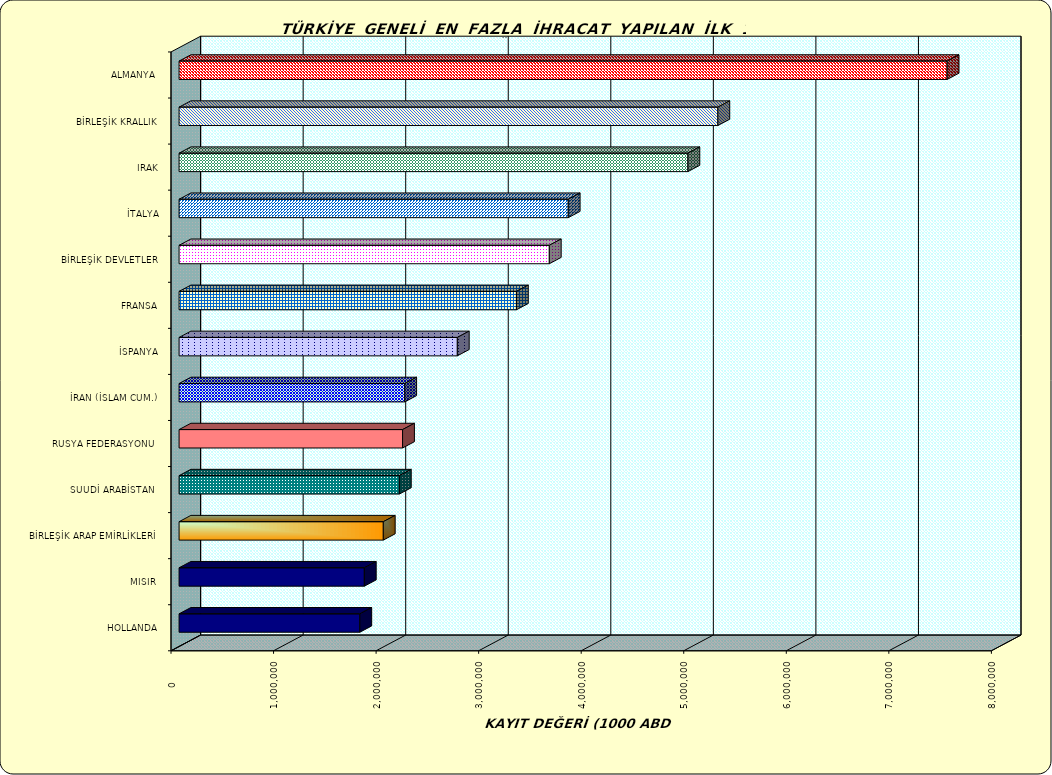
| Category | Series 0 |
|---|---|
| ALMANYA  | 7489705.227 |
| BİRLEŞİK KRALLIK | 5254062.433 |
| IRAK | 4962097.796 |
| İTALYA | 3795014.579 |
| BİRLEŞİK DEVLETLER | 3610364.549 |
| FRANSA | 3289773.694 |
| İSPANYA | 2713422.769 |
| İRAN (İSLAM CUM.) | 2200626.463 |
| RUSYA FEDERASYONU  | 2179443.67 |
| SUUDİ ARABİSTAN  | 2148340.352 |
| BİRLEŞİK ARAP EMİRLİKLERİ | 1991495.551 |
| MISIR  | 1806492.282 |
| HOLLANDA | 1762715.855 |